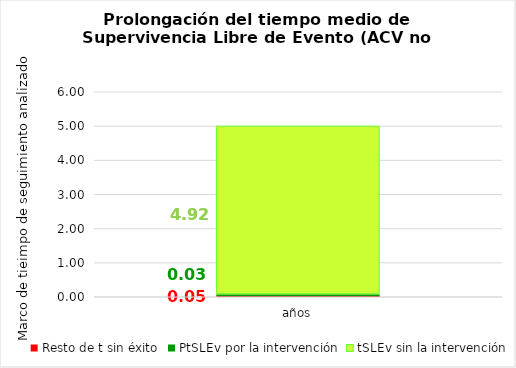
| Category | Resto de t sin éxito | PtSLEv por la intervención | tSLEv sin la intervención |
|---|---|---|---|
| años | 0.054 | 0.028 | 4.917 |